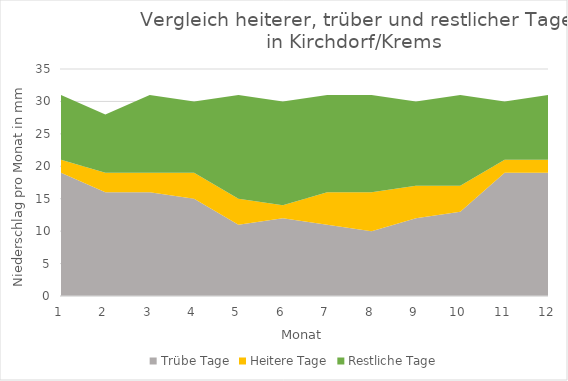
| Category | Trübe Tage | Heitere Tage | Restliche Tage |
|---|---|---|---|
| 0 | 19 | 2 | 10 |
| 1 | 16 | 3 | 9 |
| 2 | 16 | 3 | 12 |
| 3 | 15 | 4 | 11 |
| 4 | 11 | 4 | 16 |
| 5 | 12 | 2 | 16 |
| 6 | 11 | 5 | 15 |
| 7 | 10 | 6 | 15 |
| 8 | 12 | 5 | 13 |
| 9 | 13 | 4 | 14 |
| 10 | 19 | 2 | 9 |
| 11 | 19 | 2 | 10 |